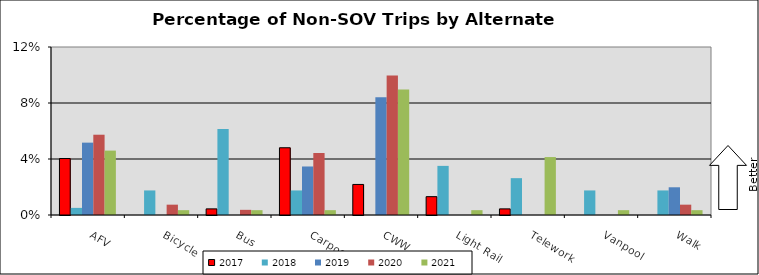
| Category | 2017 | 2018 | 2019 | 2020 | 2021 |
|---|---|---|---|---|---|
| AFV | 0.04 | 0.005 | 0.052 | 0.057 | 0.046 |
| Bicycle | 0 | 0.018 | 0 | 0.007 | 0.003 |
| Bus | 0.004 | 0.061 | 0 | 0.004 | 0.003 |
| Carpool | 0.048 | 0.018 | 0.035 | 0.044 | 0.003 |
| CWW | 0.022 | 0 | 0.084 | 0.1 | 0.09 |
| Light Rail | 0.013 | 0.035 | 0 | 0 | 0.003 |
| Telework | 0.004 | 0.026 | 0 | 0 | 0.041 |
| Vanpool | 0 | 0.018 | 0 | 0 | 0.003 |
| Walk | 0 | 0.018 | 0.02 | 0.007 | 0.003 |